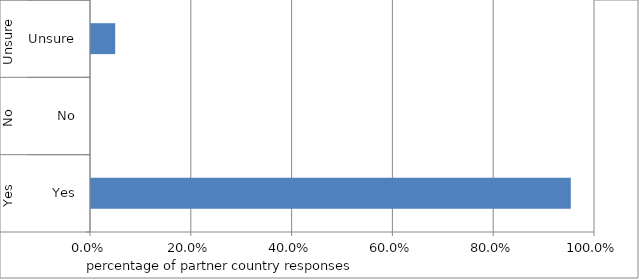
| Category | Series 0 |
|---|---|
| 0 | 0.952 |
| 1 | 0 |
| 2 | 0.048 |